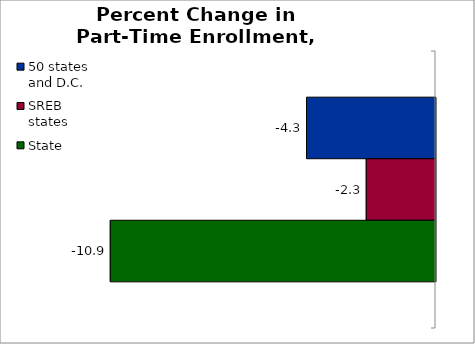
| Category | 50 states and D.C. | SREB states | State |
|---|---|---|---|
| 0 | -4.31 | -2.316 | -10.872 |